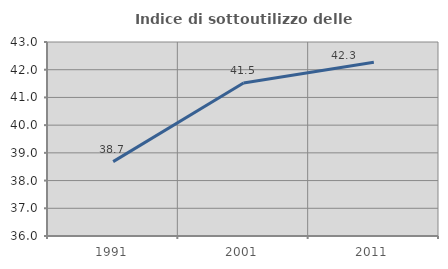
| Category | Indice di sottoutilizzo delle abitazioni  |
|---|---|
| 1991.0 | 38.683 |
| 2001.0 | 41.52 |
| 2011.0 | 42.273 |